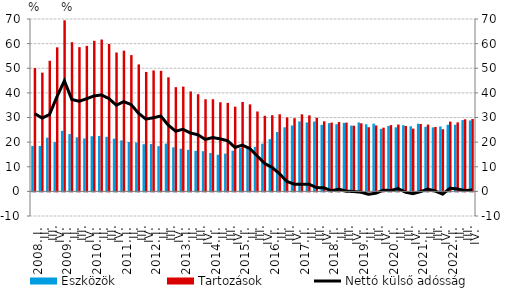
| Category | Eszközök | Tartozások |
|---|---|---|
| 2008. I. | 18.483 | 50.075 |
|          II. | 18.442 | 48.208 |
|          III. | 21.823 | 53.038 |
|          IV. | 20.026 | 58.492 |
| 2009. I. | 24.58 | 69.47 |
|          II. | 23.259 | 60.585 |
|          III. | 21.967 | 58.566 |
|          IV. | 21.482 | 59.097 |
| 2010. I. | 22.395 | 61.153 |
|          II. | 22.513 | 61.662 |
|          III. | 22.134 | 59.837 |
|          IV. | 21.402 | 56.399 |
| 2011. I. | 20.704 | 57.14 |
|          II. | 20.081 | 55.338 |
|          III. | 19.855 | 51.558 |
|          IV. | 19.152 | 48.501 |
| 2012. I. | 19.22 | 49.112 |
|          II. | 18.364 | 48.957 |
|          III. | 19.411 | 46.318 |
|          IV. | 17.87 | 42.325 |
| 2013. I. | 17.33 | 42.546 |
| II. | 16.878 | 40.585 |
|          III. | 16.459 | 39.461 |
| IV. | 16.326 | 37.42 |
| 2014. I. | 15.574 | 37.426 |
| II. | 14.875 | 36.199 |
|          III. | 15.337 | 35.925 |
| IV. | 16.531 | 34.383 |
| 2015. I. | 17.525 | 36.29 |
| II. | 17.923 | 35.336 |
|          III. | 18.103 | 32.434 |
| IV. | 19.362 | 30.694 |
| 2016. I. | 21.202 | 30.927 |
| II. | 24.137 | 31.313 |
|          III. | 26.019 | 30.04 |
| IV. | 26.769 | 29.716 |
| 2017. I. | 28.428 | 31.295 |
| II. | 27.994 | 30.876 |
|          III. | 28.351 | 29.906 |
| IV. | 27.006 | 28.455 |
| 2018. I. | 27.695 | 27.946 |
| II. | 27.291 | 28.158 |
|          III. | 27.826 | 27.931 |
| IV. | 26.738 | 26.668 |
| 2019. I. | 27.981 | 27.642 |
| II. | 27.244 | 26.05 |
|          III. | 27.502 | 26.768 |
| IV. | 25.378 | 25.866 |
| 2020. I. | 26.566 | 26.913 |
| II. | 26.012 | 27.132 |
|          III. | 26.876 | 26.546 |
| IV. | 26.433 | 25.496 |
| 2021. I. | 27.478 | 27.358 |
| II. | 26.208 | 27.121 |
|          III. | 25.986 | 26.135 |
| IV. | 26.365 | 25.239 |
| 2022. I. | 27.054 | 28.327 |
| II. | 27.051 | 28.02 |
|          III. | 28.957 | 29.265 |
| IV. | 28.802 | 29.373 |